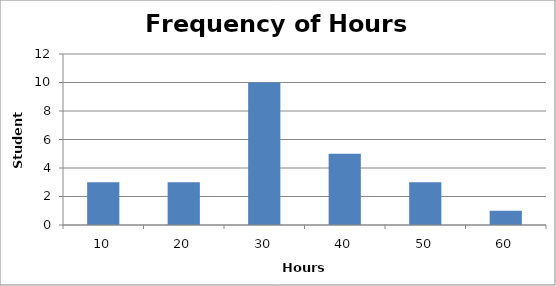
| Category | Series 0 |
|---|---|
| 10.0 | 3 |
| 20.0 | 3 |
| 30.0 | 10 |
| 40.0 | 5 |
| 50.0 | 3 |
| 60.0 | 1 |